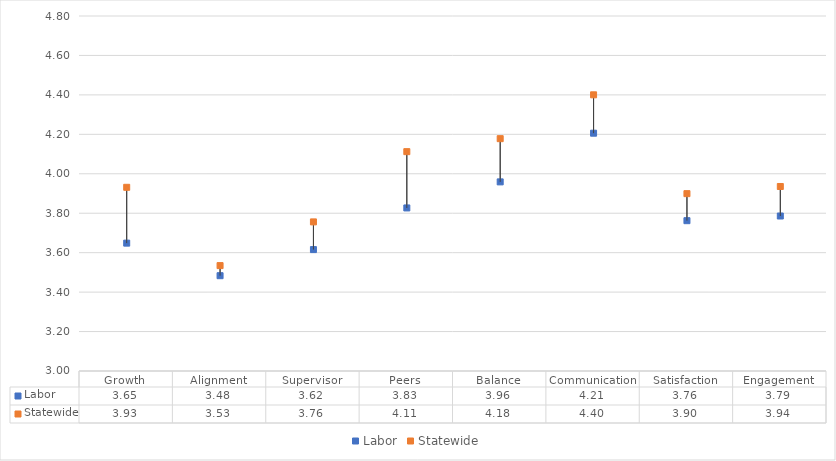
| Category | Labor | Statewide |
|---|---|---|
| Growth | 3.648 | 3.931 |
| Alignment | 3.483 | 3.534 |
| Supervisor | 3.616 | 3.756 |
| Peers | 3.827 | 4.112 |
| Balance | 3.959 | 4.178 |
| Communication | 4.206 | 4.4 |
| Satisfaction | 3.762 | 3.899 |
| Engagement | 3.786 | 3.936 |